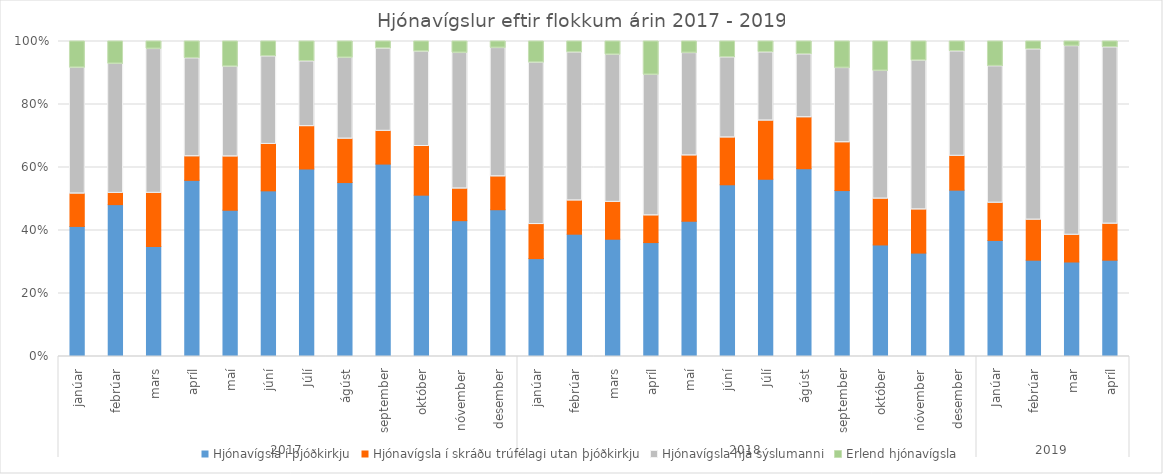
| Category | Hjónavígsla í þjóðkirkju | Hjónavígsla í skráðu trúfélagi utan þjóðkirkju | Hjónavígsla hjá sýslumanni | Erlend hjónavígsla |
|---|---|---|---|---|
| 0 | 64 | 16 | 62 | 13 |
| 1 | 54 | 4 | 46 | 8 |
| 2 | 58 | 28 | 76 | 4 |
| 3 | 104 | 14 | 58 | 10 |
| 4 | 104 | 38 | 64 | 18 |
| 5 | 264 | 74 | 140 | 24 |
| 6 | 478 | 108 | 166 | 51 |
| 7 | 296 | 74 | 138 | 28 |
| 8 | 270 | 46 | 116 | 10 |
| 9 | 126 | 38 | 74 | 8 |
| 10 | 94 | 22 | 94 | 8 |
| 11 | 178 | 40 | 156 | 8 |
| 12 | 46 | 16 | 76 | 10 |
| 13 | 66 | 18 | 80 | 6 |
| 14 | 70 | 22 | 88 | 8 |
| 15 | 68 | 16 | 84 | 20 |
| 16 | 116 | 56 | 88 | 10 |
| 17 | 278 | 76 | 130 | 26 |
| 18 | 337 | 111 | 130 | 21 |
| 19 | 434 | 118 | 146 | 30 |
| 20 | 187 | 54 | 84 | 30 |
| 21 | 68 | 28 | 78 | 18 |
| 22 | 86 | 36 | 124 | 16 |
| 23 | 216 | 44 | 136 | 13 |
| 24 | 56 | 18 | 66 | 12 |
| 25 | 48 | 20 | 85 | 4 |
| 26 | 60 | 17 | 120 | 3 |
| 27 | 48 | 18 | 88 | 3 |